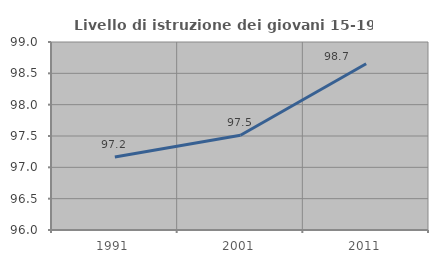
| Category | Livello di istruzione dei giovani 15-19 anni |
|---|---|
| 1991.0 | 97.166 |
| 2001.0 | 97.512 |
| 2011.0 | 98.652 |